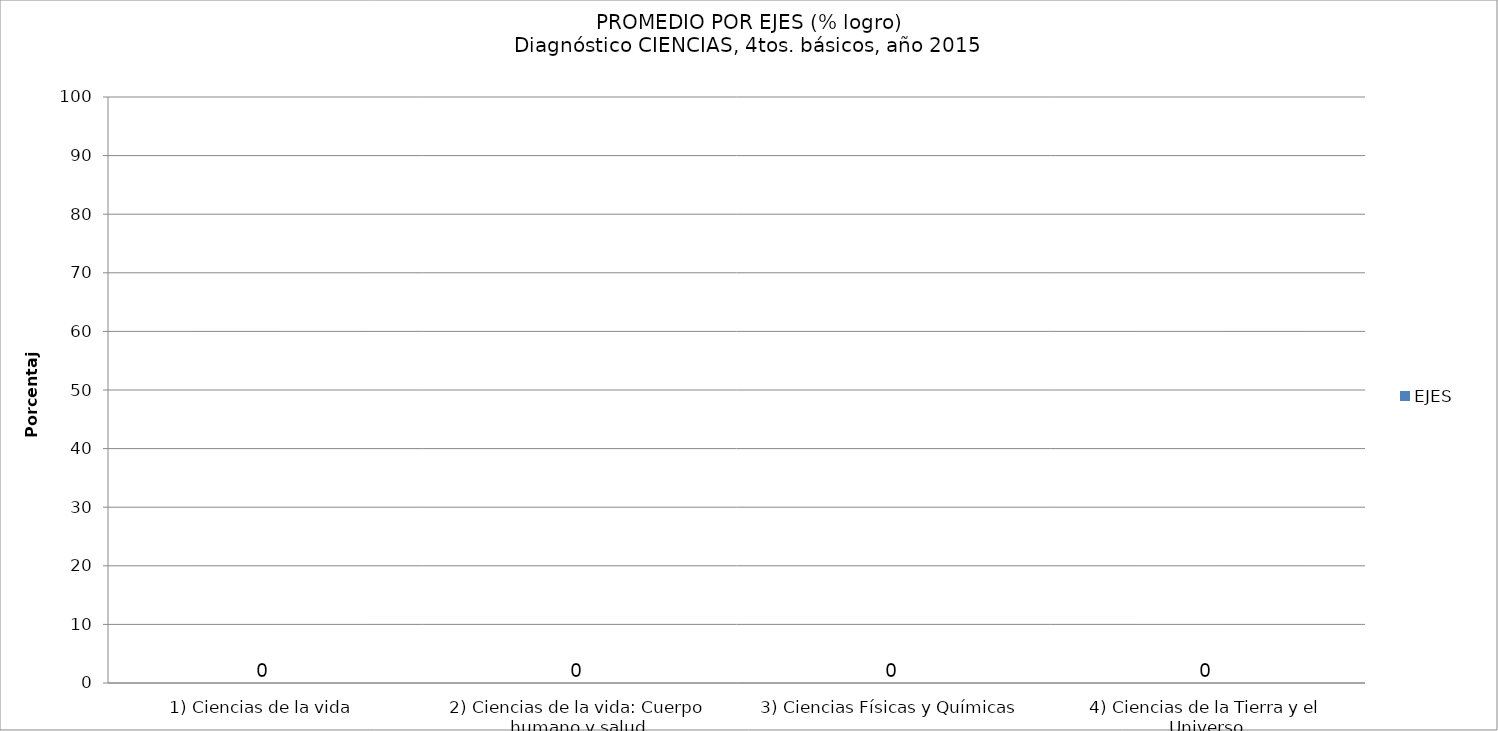
| Category | EJES |
|---|---|
| 1) Ciencias de la vida | 0 |
| 2) Ciencias de la vida: Cuerpo humano y salud | 0 |
| 3) Ciencias Físicas y Químicas | 0 |
| 4) Ciencias de la Tierra y el Universo | 0 |